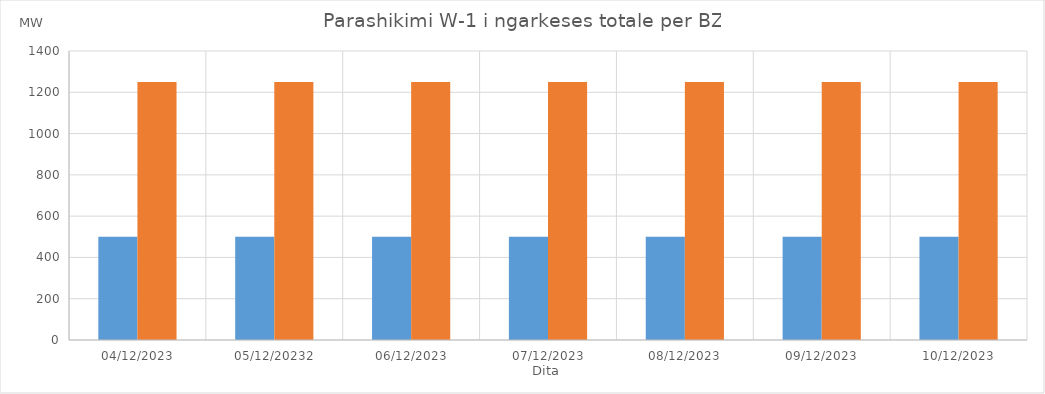
| Category | Min (MW) | Max (MW) |
|---|---|---|
| 04/12/2023 | 500 | 1250 |
| 05/12/20232 | 500 | 1250 |
| 06/12/2023 | 500 | 1250 |
| 07/12/2023 | 500 | 1250 |
| 08/12/2023 | 500 | 1250 |
| 09/12/2023 | 500 | 1250 |
| 10/12/2023 | 500 | 1250 |